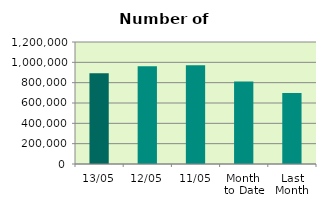
| Category | Series 0 |
|---|---|
| 13/05 | 892678 |
| 12/05 | 960436 |
| 11/05 | 970594 |
| Month 
to Date | 811851.778 |
| Last
Month | 699227 |